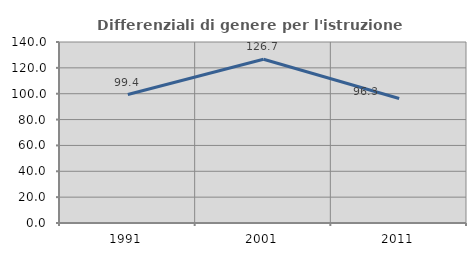
| Category | Differenziali di genere per l'istruzione superiore |
|---|---|
| 1991.0 | 99.359 |
| 2001.0 | 126.667 |
| 2011.0 | 96.324 |